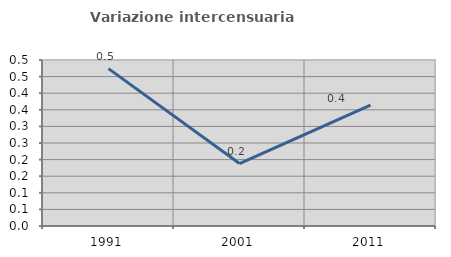
| Category | Variazione intercensuaria annua |
|---|---|
| 1991.0 | 0.474 |
| 2001.0 | 0.188 |
| 2011.0 | 0.364 |